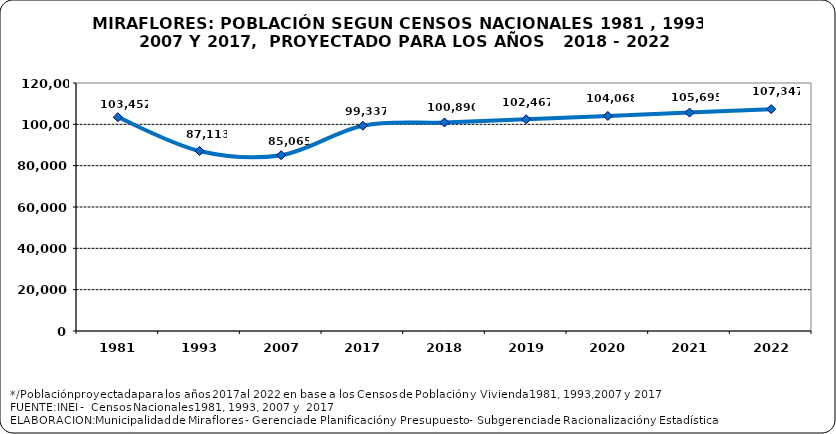
| Category | Series 0 |
|---|---|
| 1981.0 | 103452 |
| 1993.0 | 87113 |
| 2007.0 | 85065 |
| 2017.0 | 99337 |
| 2018.0 | 100889.752 |
| 2019.0 | 102466.775 |
| 2020.0 | 104068.449 |
| 2021.0 | 105695.158 |
| 2022.0 | 107347.295 |